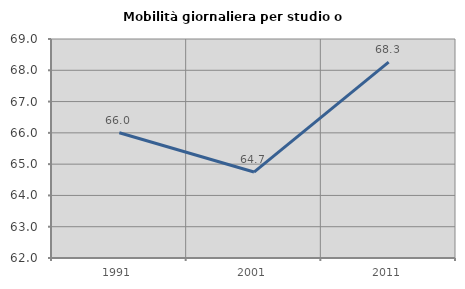
| Category | Mobilità giornaliera per studio o lavoro |
|---|---|
| 1991.0 | 66.002 |
| 2001.0 | 64.747 |
| 2011.0 | 68.262 |